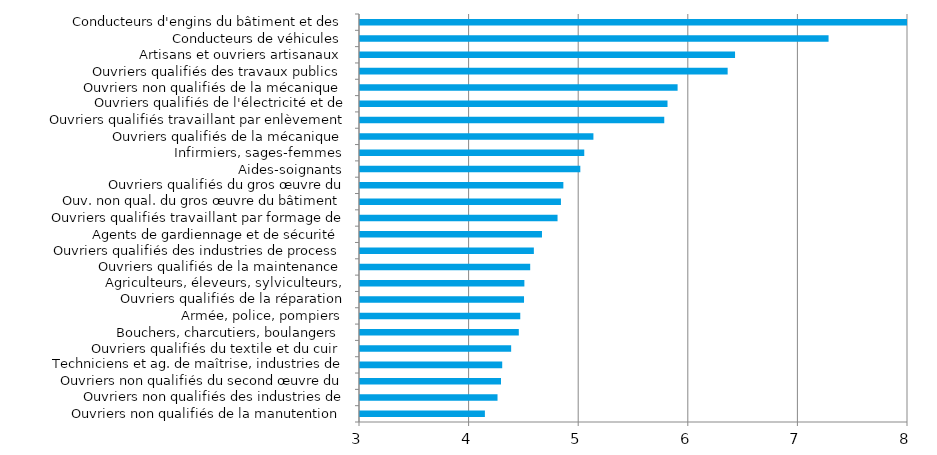
| Category | Series 0 |
|---|---|
| Ouvriers non qualifiés de la manutention | 4.14 |
| Ouvriers non qualifiés des industries de process | 4.255 |
| Ouvriers non qualifiés du second œuvre du bâtiment | 4.287 |
| Techniciens et ag. de maîtrise, industries de process | 4.298 |
| Ouvriers qualifiés du textile et du cuir | 4.379 |
| Bouchers, charcutiers, boulangers | 4.449 |
| Armée, police, pompiers | 4.462 |
| Ouvriers qualifiés de la réparation automobile | 4.497 |
| Agriculteurs, éleveurs, sylviculteurs, bûcherons | 4.5 |
| Ouvriers qualifiés de la maintenance | 4.553 |
| Ouvriers qualifiés des industries de process | 4.586 |
| Agents de gardiennage et de sécurité | 4.66 |
| Ouvriers qualifiés travaillant par formage de métal | 4.802 |
| Ouv. non qual. du gros œuvre du bâtiment et tr. publics | 4.833 |
| Ouvriers qualifiés du gros œuvre du bâtiment | 4.855 |
| Aides-soignants | 5.01 |
| Infirmiers, sages-femmes | 5.046 |
| Ouvriers qualifiés de la mécanique | 5.13 |
| Ouvriers qualifiés travaillant par enlèvement de métal | 5.776 |
| Ouvriers qualifiés de l'électricité et de l'électronique | 5.806 |
| Ouvriers non qualifiés de la mécanique | 5.898 |
| Ouvriers qualifiés des travaux publics | 6.354 |
| Artisans et ouvriers artisanaux | 6.422 |
| Conducteurs de véhicules | 7.275 |
| Conducteurs d'engins du bâtiment et des travaux publics | 8.016 |